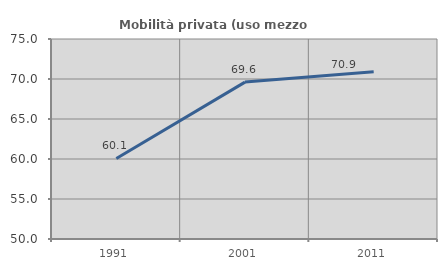
| Category | Mobilità privata (uso mezzo privato) |
|---|---|
| 1991.0 | 60.068 |
| 2001.0 | 69.61 |
| 2011.0 | 70.907 |